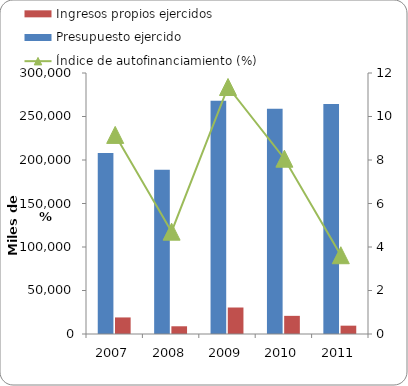
| Category | Presupuesto ejercido | Ingresos propios ejercidos  |
|---|---|---|
| 2007 | 207984 | 19039 |
| 2008 | 188678 | 8878 |
| 2009 | 268119 | 30450 |
| 2010 | 258863 | 20865 |
| 2011 | 264391.6 | 9574.8 |